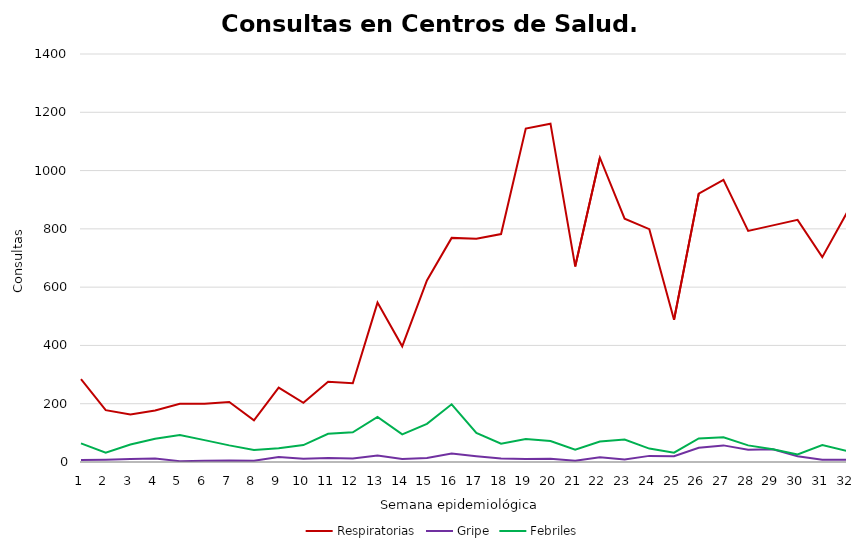
| Category | Respiratorias | Gripe | Febriles |
|---|---|---|---|
| 1.0 | 284 | 7 | 64 |
| 2.0 | 178 | 8 | 32 |
| 3.0 | 163 | 10 | 60 |
| 4.0 | 177 | 12 | 80 |
| 5.0 | 200 | 3 | 93 |
| 6.0 | 200 | 4 | 75 |
| 7.0 | 206 | 5 | 57 |
| 8.0 | 143 | 4 | 41 |
| 9.0 | 255 | 17 | 47 |
| 10.0 | 203 | 11 | 58 |
| 11.0 | 275 | 14 | 97 |
| 12.0 | 270 | 12 | 102 |
| 13.0 | 547 | 22 | 155 |
| 14.0 | 397 | 10 | 95 |
| 15.0 | 623 | 14 | 131 |
| 16.0 | 769 | 29 | 198 |
| 17.0 | 766 | 20 | 100 |
| 18.0 | 782 | 12 | 63 |
| 19.0 | 1144 | 10 | 79 |
| 20.0 | 1161 | 11 | 72 |
| 21.0 | 671 | 4 | 42 |
| 22.0 | 1044 | 16 | 70 |
| 23.0 | 835 | 9 | 77 |
| 24.0 | 799 | 21 | 46 |
| 25.0 | 488 | 20 | 32 |
| 26.0 | 921 | 49 | 81 |
| 27.0 | 968 | 57 | 85 |
| 28.0 | 793 | 42 | 57 |
| 29.0 | 812 | 44 | 44 |
| 30.0 | 831 | 20 | 26 |
| 31.0 | 703 | 8 | 58 |
| 32.0 | 856 | 8 | 38 |